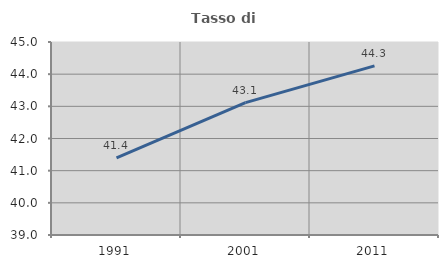
| Category | Tasso di occupazione   |
|---|---|
| 1991.0 | 41.395 |
| 2001.0 | 43.115 |
| 2011.0 | 44.258 |